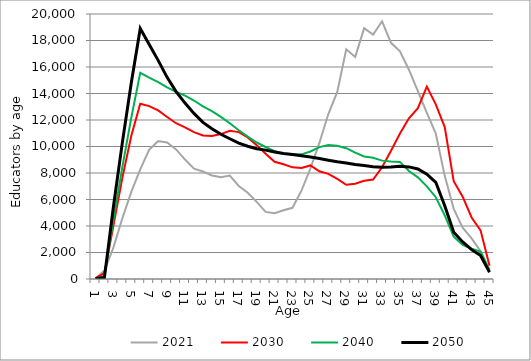
| Category | 2021 | 2030 | 2040 | 2050 |
|---|---|---|---|---|
| 0 | 44 | 60 | 30 | 20 |
| 1 | 638 | 452 | 224 | 114 |
| 2 | 2367 | 4021 | 4438 | 5432 |
| 3 | 4579 | 7636 | 8446 | 10294 |
| 4 | 6575 | 10815 | 12179 | 14811 |
| 5 | 8276 | 13226 | 15560 | 18902 |
| 6 | 9762 | 13051 | 15194 | 17700 |
| 7 | 10406 | 12719 | 14864 | 16500 |
| 8 | 10304 | 12227 | 14470 | 15220 |
| 9 | 9777 | 11757 | 14130 | 14145 |
| 10 | 9015 | 11446 | 13839 | 13275 |
| 11 | 8322 | 11088 | 13471 | 12500 |
| 12 | 8110 | 10831 | 13031 | 11820 |
| 13 | 7813 | 10786 | 12666 | 11341 |
| 14 | 7675 | 10936 | 12230 | 10922 |
| 15 | 7802 | 11193 | 11755 | 10587 |
| 16 | 7020 | 11088 | 11226 | 10261 |
| 17 | 6510 | 10684 | 10744 | 10023 |
| 18 | 5818 | 10102 | 10301 | 9832 |
| 19 | 5064 | 9459 | 9962 | 9726 |
| 20 | 4966 | 8843 | 9657 | 9579 |
| 21 | 5189 | 8661 | 9454 | 9476 |
| 22 | 5375 | 8426 | 9395 | 9400 |
| 23 | 6668 | 8373 | 9407 | 9305 |
| 24 | 8339 | 8570 | 9622 | 9204 |
| 25 | 10270 | 8127 | 9951 | 9087 |
| 26 | 12448 | 7938 | 10113 | 8970 |
| 27 | 14123 | 7555 | 10061 | 8853 |
| 28 | 17335 | 7110 | 9873 | 8757 |
| 29 | 16760 | 7187 | 9541 | 8647 |
| 30 | 18929 | 7414 | 9244 | 8571 |
| 31 | 18448 | 7509 | 9151 | 8472 |
| 32 | 19449 | 8432 | 8934 | 8432 |
| 33 | 17823 | 9672 | 8871 | 8459 |
| 34 | 17182 | 10973 | 8839 | 8501 |
| 35 | 15795 | 12131 | 8154 | 8462 |
| 36 | 14176 | 12888 | 7672 | 8304 |
| 37 | 12532 | 14520 | 6996 | 7907 |
| 38 | 10984 | 13183 | 6174 | 7298 |
| 39 | 7785 | 11465 | 4801 | 5533 |
| 40 | 5295 | 7376 | 3196 | 3531 |
| 41 | 3875 | 6217 | 2572 | 2800 |
| 42 | 3063 | 4644 | 2291 | 2215 |
| 43 | 2095 | 3675 | 2070 | 1766 |
| 44 | 688 | 1003 | 670 | 515 |